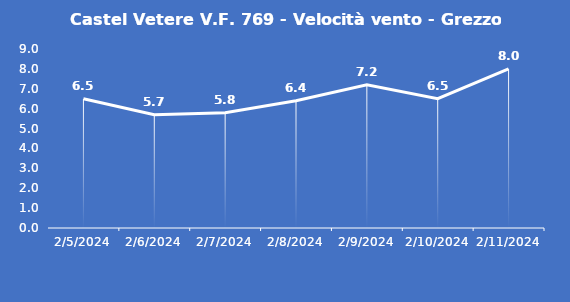
| Category | Castel Vetere V.F. 769 - Velocità vento - Grezzo (m/s) |
|---|---|
| 2/5/24 | 6.5 |
| 2/6/24 | 5.7 |
| 2/7/24 | 5.8 |
| 2/8/24 | 6.4 |
| 2/9/24 | 7.2 |
| 2/10/24 | 6.5 |
| 2/11/24 | 8 |